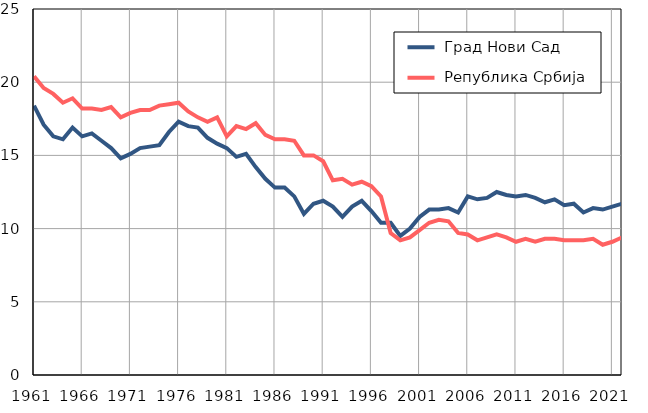
| Category |  Град Нови Сад |  Република Србија |
|---|---|---|
| 1961.0 | 18.4 | 20.4 |
| 1962.0 | 17.1 | 19.6 |
| 1963.0 | 16.3 | 19.2 |
| 1964.0 | 16.1 | 18.6 |
| 1965.0 | 16.9 | 18.9 |
| 1966.0 | 16.3 | 18.2 |
| 1967.0 | 16.5 | 18.2 |
| 1968.0 | 16 | 18.1 |
| 1969.0 | 15.5 | 18.3 |
| 1970.0 | 14.8 | 17.6 |
| 1971.0 | 15.1 | 17.9 |
| 1972.0 | 15.5 | 18.1 |
| 1973.0 | 15.6 | 18.1 |
| 1974.0 | 15.7 | 18.4 |
| 1975.0 | 16.6 | 18.5 |
| 1976.0 | 17.3 | 18.6 |
| 1977.0 | 17 | 18 |
| 1978.0 | 16.9 | 17.6 |
| 1979.0 | 16.2 | 17.3 |
| 1980.0 | 15.8 | 17.6 |
| 1981.0 | 15.5 | 16.3 |
| 1982.0 | 14.9 | 17 |
| 1983.0 | 15.1 | 16.8 |
| 1984.0 | 14.2 | 17.2 |
| 1985.0 | 13.4 | 16.4 |
| 1986.0 | 12.8 | 16.1 |
| 1987.0 | 12.8 | 16.1 |
| 1988.0 | 12.2 | 16 |
| 1989.0 | 11 | 15 |
| 1990.0 | 11.7 | 15 |
| 1991.0 | 11.9 | 14.6 |
| 1992.0 | 11.5 | 13.3 |
| 1993.0 | 10.8 | 13.4 |
| 1994.0 | 11.5 | 13 |
| 1995.0 | 11.9 | 13.2 |
| 1996.0 | 11.2 | 12.9 |
| 1997.0 | 10.4 | 12.2 |
| 1998.0 | 10.4 | 9.7 |
| 1999.0 | 9.5 | 9.2 |
| 2000.0 | 10 | 9.4 |
| 2001.0 | 10.8 | 9.9 |
| 2002.0 | 11.3 | 10.4 |
| 2003.0 | 11.3 | 10.6 |
| 2004.0 | 11.4 | 10.5 |
| 2005.0 | 11.1 | 9.7 |
| 2006.0 | 12.2 | 9.6 |
| 2007.0 | 12 | 9.2 |
| 2008.0 | 12.1 | 9.4 |
| 2009.0 | 12.5 | 9.6 |
| 2010.0 | 12.3 | 9.4 |
| 2011.0 | 12.2 | 9.1 |
| 2012.0 | 12.3 | 9.3 |
| 2013.0 | 12.1 | 9.1 |
| 2014.0 | 11.8 | 9.3 |
| 2015.0 | 12 | 9.3 |
| 2016.0 | 11.6 | 9.2 |
| 2017.0 | 11.7 | 9.2 |
| 2018.0 | 11.1 | 9.2 |
| 2019.0 | 11.4 | 9.3 |
| 2020.0 | 11.3 | 8.9 |
| 2021.0 | 11.5 | 9.1 |
| 2022.0 | 11.7 | 9.4 |